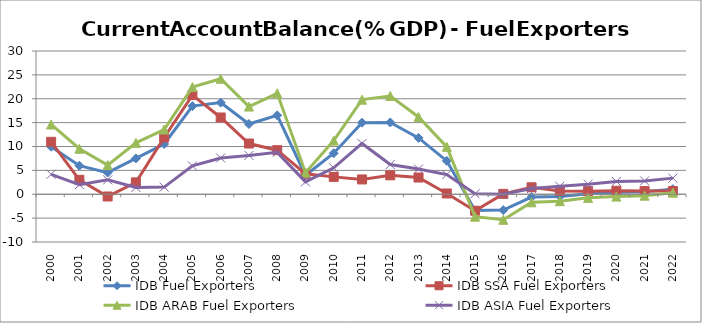
| Category | IDB Fuel Exporters | IDB SSA Fuel Exporters | IDB ARAB Fuel Exporters | IDB ASIA Fuel Exporters |
|---|---|---|---|---|
| 2000.0 | 9.96 | 10.982 | 14.616 | 4.181 |
| 2001.0 | 5.988 | 3.02 | 9.527 | 2.009 |
| 2002.0 | 4.536 | -0.47 | 6.109 | 3.011 |
| 2003.0 | 7.508 | 2.486 | 10.76 | 1.422 |
| 2004.0 | 10.53 | 11.885 | 13.555 | 1.497 |
| 2005.0 | 18.458 | 20.767 | 22.444 | 5.935 |
| 2006.0 | 19.188 | 16.08 | 24.198 | 7.6 |
| 2007.0 | 14.703 | 10.623 | 18.361 | 8.132 |
| 2008.0 | 16.524 | 9.231 | 21.14 | 8.768 |
| 2009.0 | 3.968 | 4.277 | 4.518 | 2.603 |
| 2010.0 | 8.586 | 3.639 | 11.24 | 5.528 |
| 2011.0 | 14.988 | 3.101 | 19.814 | 10.633 |
| 2012.0 | 15.038 | 3.962 | 20.588 | 6.233 |
| 2013.0 | 11.795 | 3.499 | 16.193 | 5.292 |
| 2014.0 | 6.988 | 0.163 | 9.925 | 4.12 |
| 2015.0 | -3.413 | -3.452 | -4.695 | 0.102 |
| 2016.0 | -3.317 | 0.084 | -5.345 | -0.001 |
| 2017.0 | -0.579 | 1.463 | -1.683 | 1.213 |
| 2018.0 | -0.46 | 0.695 | -1.459 | 1.66 |
| 2019.0 | 0.096 | 0.651 | -0.749 | 2.105 |
| 2020.0 | 0.405 | 0.733 | -0.494 | 2.685 |
| 2021.0 | 0.547 | 0.666 | -0.295 | 2.792 |
| 2022.0 | 1.072 | 0.679 | 0.326 | 3.378 |